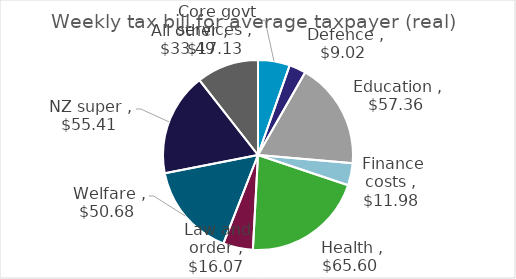
| Category | Series 0 |
|---|---|
|  Core govt services  | 17.128 |
|  Defence  | 9.025 |
|  Education  | 57.361 |
|  Finance costs  | 11.983 |
|  Health  | 65.6 |
|  Law and order  | 16.072 |
|  Welfare  | 50.676 |
|  NZ super  | 55.413 |
|  All other  | 33.493 |